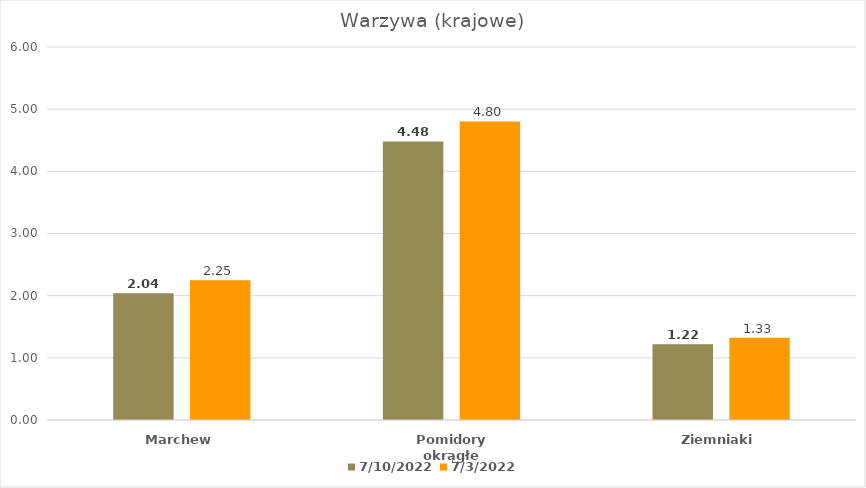
| Category | 2022-07-10 | 2022-07-03 |
|---|---|---|
| Marchew | 2.04 | 2.25 |
| Pomidory okrągłe | 4.48 | 4.803 |
| Ziemniaki | 1.22 | 1.325 |